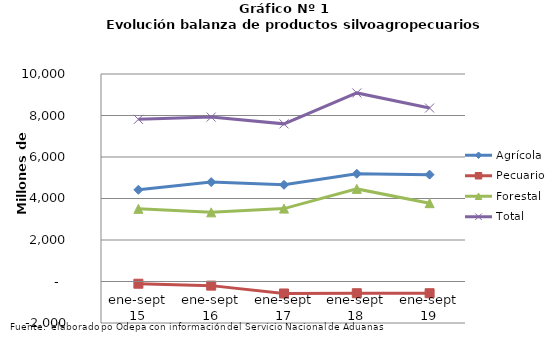
| Category | Agrícola | Pecuario | Forestal | Total |
|---|---|---|---|---|
| ene-sept 15 | 4420290 | -107289 | 3501852 | 7814853 |
| ene-sept 16 | 4790269 | -199050 | 3332472 | 7923691 |
| ene-sept 17 | 4661104 | -577501 | 3513486 | 7597089 |
| ene-sept 18 | 5190371 | -565290 | 4462457 | 9087538 |
| ene-sept 19 | 5149789 | -565277 | 3774994 | 8359506 |